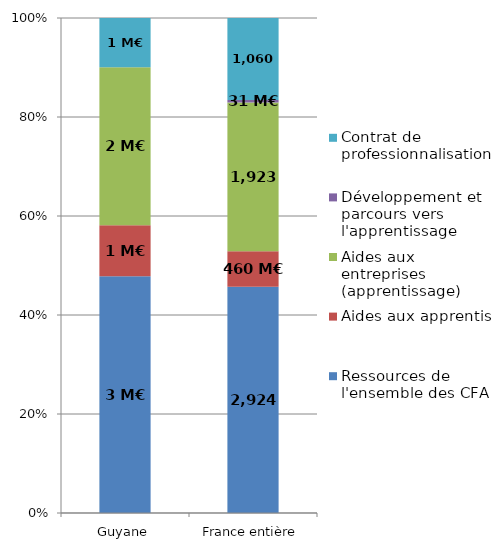
| Category | Ressources de l'ensemble des CFA | Aides aux apprentis | Aides aux entreprises (apprentissage) | Développement et parcours vers l'apprentissage | Contrat de professionnalisation |
|---|---|---|---|---|---|
| Guyane | 3.072 | 0.662 | 2.05 | 0 | 0.639 |
| France entière | 2924.219 | 459.796 | 1923.184 | 31.421 | 1060.48 |